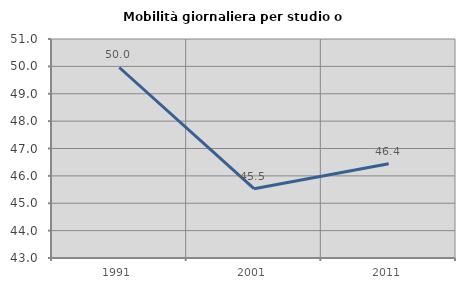
| Category | Mobilità giornaliera per studio o lavoro |
|---|---|
| 1991.0 | 49.959 |
| 2001.0 | 45.532 |
| 2011.0 | 46.443 |